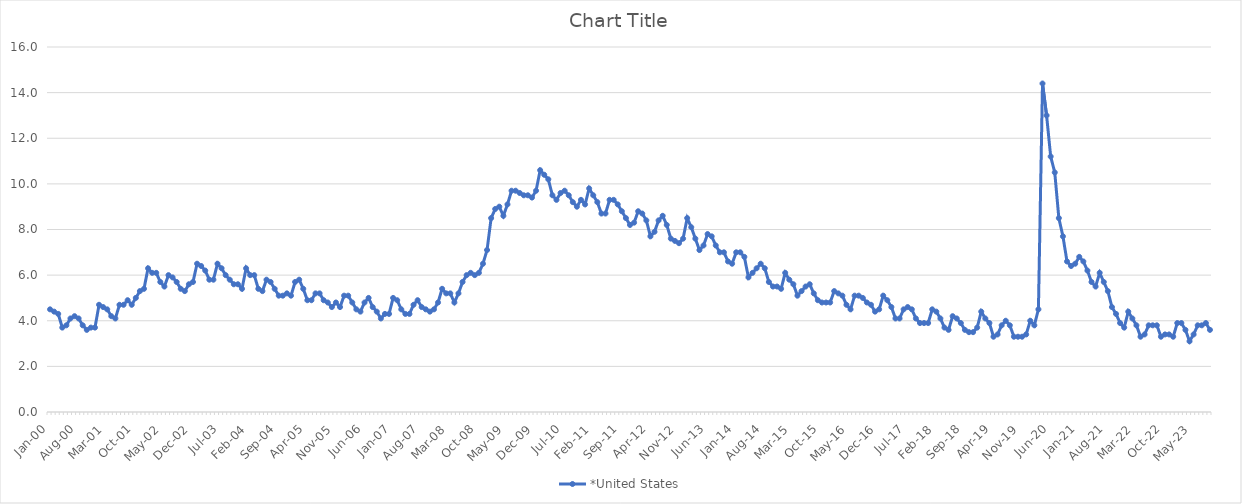
| Category | *United States | Alaska | Alabama | Arkansas | Arizona | California | Colorado | Connecticut | Delaware | Florida | Georgia | Hawaii | Iowa | Idaho | Illinois | Indiana | Kansas | Kentucky | Louisiana | Massachusetts | Maryland | Maine | Michigan | Minnesota | Missouri | Mississippi | Montana | North Carolina | North Dakota | Nebraska | New Hampshire | New Jersey | New Mexico | Nevada | New York | Ohio | Oklahoma | Oregon | Pennsylvania | Rhode Island | South Carolina | South Dakota | Tennessee | Texas | Utah | Virginia | Vermont | Washington | Wisconsin | West Virginia | Wyoming |
|---|---|---|---|---|---|---|---|---|---|---|---|---|---|---|---|---|---|---|---|---|---|---|---|---|---|---|---|---|---|---|---|---|---|---|---|---|---|---|---|---|---|---|---|---|---|---|---|---|---|---|---|
| Jan-00 | 4.5 |  |  |  |  |  |  |  |  |  |  |  |  |  |  |  |  |  |  |  |  |  |  |  |  |  |  |  |  |  |  |  |  |  |  |  |  |  |  |  |  |  |  |  |  |  |  |  |  |  |  |
| Feb-00 | 4.4 |  |  |  |  |  |  |  |  |  |  |  |  |  |  |  |  |  |  |  |  |  |  |  |  |  |  |  |  |  |  |  |  |  |  |  |  |  |  |  |  |  |  |  |  |  |  |  |  |  |  |
| Mar-00 | 4.3 |  |  |  |  |  |  |  |  |  |  |  |  |  |  |  |  |  |  |  |  |  |  |  |  |  |  |  |  |  |  |  |  |  |  |  |  |  |  |  |  |  |  |  |  |  |  |  |  |  |  |
| Apr-00 | 3.7 |  |  |  |  |  |  |  |  |  |  |  |  |  |  |  |  |  |  |  |  |  |  |  |  |  |  |  |  |  |  |  |  |  |  |  |  |  |  |  |  |  |  |  |  |  |  |  |  |  |  |
| May-00 | 3.8 |  |  |  |  |  |  |  |  |  |  |  |  |  |  |  |  |  |  |  |  |  |  |  |  |  |  |  |  |  |  |  |  |  |  |  |  |  |  |  |  |  |  |  |  |  |  |  |  |  |  |
| Jun-00 | 4.1 |  |  |  |  |  |  |  |  |  |  |  |  |  |  |  |  |  |  |  |  |  |  |  |  |  |  |  |  |  |  |  |  |  |  |  |  |  |  |  |  |  |  |  |  |  |  |  |  |  |  |
| Jul-00 | 4.2 |  |  |  |  |  |  |  |  |  |  |  |  |  |  |  |  |  |  |  |  |  |  |  |  |  |  |  |  |  |  |  |  |  |  |  |  |  |  |  |  |  |  |  |  |  |  |  |  |  |  |
| Aug-00 | 4.1 |  |  |  |  |  |  |  |  |  |  |  |  |  |  |  |  |  |  |  |  |  |  |  |  |  |  |  |  |  |  |  |  |  |  |  |  |  |  |  |  |  |  |  |  |  |  |  |  |  |  |
| Sep-00 | 3.8 |  |  |  |  |  |  |  |  |  |  |  |  |  |  |  |  |  |  |  |  |  |  |  |  |  |  |  |  |  |  |  |  |  |  |  |  |  |  |  |  |  |  |  |  |  |  |  |  |  |  |
| Oct-00 | 3.6 |  |  |  |  |  |  |  |  |  |  |  |  |  |  |  |  |  |  |  |  |  |  |  |  |  |  |  |  |  |  |  |  |  |  |  |  |  |  |  |  |  |  |  |  |  |  |  |  |  |  |
| Nov-00 | 3.7 |  |  |  |  |  |  |  |  |  |  |  |  |  |  |  |  |  |  |  |  |  |  |  |  |  |  |  |  |  |  |  |  |  |  |  |  |  |  |  |  |  |  |  |  |  |  |  |  |  |  |
| Dec-00 | 3.7 |  |  |  |  |  |  |  |  |  |  |  |  |  |  |  |  |  |  |  |  |  |  |  |  |  |  |  |  |  |  |  |  |  |  |  |  |  |  |  |  |  |  |  |  |  |  |  |  |  |  |
| Jan-01 | 4.7 |  |  |  |  |  |  |  |  |  |  |  |  |  |  |  |  |  |  |  |  |  |  |  |  |  |  |  |  |  |  |  |  |  |  |  |  |  |  |  |  |  |  |  |  |  |  |  |  |  |  |
| Feb-01 | 4.6 |  |  |  |  |  |  |  |  |  |  |  |  |  |  |  |  |  |  |  |  |  |  |  |  |  |  |  |  |  |  |  |  |  |  |  |  |  |  |  |  |  |  |  |  |  |  |  |  |  |  |
| Mar-01 | 4.5 |  |  |  |  |  |  |  |  |  |  |  |  |  |  |  |  |  |  |  |  |  |  |  |  |  |  |  |  |  |  |  |  |  |  |  |  |  |  |  |  |  |  |  |  |  |  |  |  |  |  |
| Apr-01 | 4.2 |  |  |  |  |  |  |  |  |  |  |  |  |  |  |  |  |  |  |  |  |  |  |  |  |  |  |  |  |  |  |  |  |  |  |  |  |  |  |  |  |  |  |  |  |  |  |  |  |  |  |
| May-01 | 4.1 |  |  |  |  |  |  |  |  |  |  |  |  |  |  |  |  |  |  |  |  |  |  |  |  |  |  |  |  |  |  |  |  |  |  |  |  |  |  |  |  |  |  |  |  |  |  |  |  |  |  |
| Jun-01 | 4.7 |  |  |  |  |  |  |  |  |  |  |  |  |  |  |  |  |  |  |  |  |  |  |  |  |  |  |  |  |  |  |  |  |  |  |  |  |  |  |  |  |  |  |  |  |  |  |  |  |  |  |
| Jul-01 | 4.7 |  |  |  |  |  |  |  |  |  |  |  |  |  |  |  |  |  |  |  |  |  |  |  |  |  |  |  |  |  |  |  |  |  |  |  |  |  |  |  |  |  |  |  |  |  |  |  |  |  |  |
| Aug-01 | 4.9 |  |  |  |  |  |  |  |  |  |  |  |  |  |  |  |  |  |  |  |  |  |  |  |  |  |  |  |  |  |  |  |  |  |  |  |  |  |  |  |  |  |  |  |  |  |  |  |  |  |  |
| Sep-01 | 4.7 |  |  |  |  |  |  |  |  |  |  |  |  |  |  |  |  |  |  |  |  |  |  |  |  |  |  |  |  |  |  |  |  |  |  |  |  |  |  |  |  |  |  |  |  |  |  |  |  |  |  |
| Oct-01 | 5 |  |  |  |  |  |  |  |  |  |  |  |  |  |  |  |  |  |  |  |  |  |  |  |  |  |  |  |  |  |  |  |  |  |  |  |  |  |  |  |  |  |  |  |  |  |  |  |  |  |  |
| Nov-01 | 5.3 |  |  |  |  |  |  |  |  |  |  |  |  |  |  |  |  |  |  |  |  |  |  |  |  |  |  |  |  |  |  |  |  |  |  |  |  |  |  |  |  |  |  |  |  |  |  |  |  |  |  |
| Dec-01 | 5.4 |  |  |  |  |  |  |  |  |  |  |  |  |  |  |  |  |  |  |  |  |  |  |  |  |  |  |  |  |  |  |  |  |  |  |  |  |  |  |  |  |  |  |  |  |  |  |  |  |  |  |
| Jan-02 | 6.3 |  |  |  |  |  |  |  |  |  |  |  |  |  |  |  |  |  |  |  |  |  |  |  |  |  |  |  |  |  |  |  |  |  |  |  |  |  |  |  |  |  |  |  |  |  |  |  |  |  |  |
| Feb-02 | 6.1 |  |  |  |  |  |  |  |  |  |  |  |  |  |  |  |  |  |  |  |  |  |  |  |  |  |  |  |  |  |  |  |  |  |  |  |  |  |  |  |  |  |  |  |  |  |  |  |  |  |  |
| Mar-02 | 6.1 |  |  |  |  |  |  |  |  |  |  |  |  |  |  |  |  |  |  |  |  |  |  |  |  |  |  |  |  |  |  |  |  |  |  |  |  |  |  |  |  |  |  |  |  |  |  |  |  |  |  |
| Apr-02 | 5.7 |  |  |  |  |  |  |  |  |  |  |  |  |  |  |  |  |  |  |  |  |  |  |  |  |  |  |  |  |  |  |  |  |  |  |  |  |  |  |  |  |  |  |  |  |  |  |  |  |  |  |
| May-02 | 5.5 |  |  |  |  |  |  |  |  |  |  |  |  |  |  |  |  |  |  |  |  |  |  |  |  |  |  |  |  |  |  |  |  |  |  |  |  |  |  |  |  |  |  |  |  |  |  |  |  |  |  |
| Jun-02 | 6 |  |  |  |  |  |  |  |  |  |  |  |  |  |  |  |  |  |  |  |  |  |  |  |  |  |  |  |  |  |  |  |  |  |  |  |  |  |  |  |  |  |  |  |  |  |  |  |  |  |  |
| Jul-02 | 5.9 |  |  |  |  |  |  |  |  |  |  |  |  |  |  |  |  |  |  |  |  |  |  |  |  |  |  |  |  |  |  |  |  |  |  |  |  |  |  |  |  |  |  |  |  |  |  |  |  |  |  |
| Aug-02 | 5.7 |  |  |  |  |  |  |  |  |  |  |  |  |  |  |  |  |  |  |  |  |  |  |  |  |  |  |  |  |  |  |  |  |  |  |  |  |  |  |  |  |  |  |  |  |  |  |  |  |  |  |
| Sep-02 | 5.4 |  |  |  |  |  |  |  |  |  |  |  |  |  |  |  |  |  |  |  |  |  |  |  |  |  |  |  |  |  |  |  |  |  |  |  |  |  |  |  |  |  |  |  |  |  |  |  |  |  |  |
| Oct-02 | 5.3 |  |  |  |  |  |  |  |  |  |  |  |  |  |  |  |  |  |  |  |  |  |  |  |  |  |  |  |  |  |  |  |  |  |  |  |  |  |  |  |  |  |  |  |  |  |  |  |  |  |  |
| Nov-02 | 5.6 |  |  |  |  |  |  |  |  |  |  |  |  |  |  |  |  |  |  |  |  |  |  |  |  |  |  |  |  |  |  |  |  |  |  |  |  |  |  |  |  |  |  |  |  |  |  |  |  |  |  |
| Dec-02 | 5.7 |  |  |  |  |  |  |  |  |  |  |  |  |  |  |  |  |  |  |  |  |  |  |  |  |  |  |  |  |  |  |  |  |  |  |  |  |  |  |  |  |  |  |  |  |  |  |  |  |  |  |
| Jan-03 | 6.5 |  |  |  |  |  |  |  |  |  |  |  |  |  |  |  |  |  |  |  |  |  |  |  |  |  |  |  |  |  |  |  |  |  |  |  |  |  |  |  |  |  |  |  |  |  |  |  |  |  |  |
| Feb-03 | 6.4 |  |  |  |  |  |  |  |  |  |  |  |  |  |  |  |  |  |  |  |  |  |  |  |  |  |  |  |  |  |  |  |  |  |  |  |  |  |  |  |  |  |  |  |  |  |  |  |  |  |  |
| Mar-03 | 6.2 |  |  |  |  |  |  |  |  |  |  |  |  |  |  |  |  |  |  |  |  |  |  |  |  |  |  |  |  |  |  |  |  |  |  |  |  |  |  |  |  |  |  |  |  |  |  |  |  |  |  |
| Apr-03 | 5.8 |  |  |  |  |  |  |  |  |  |  |  |  |  |  |  |  |  |  |  |  |  |  |  |  |  |  |  |  |  |  |  |  |  |  |  |  |  |  |  |  |  |  |  |  |  |  |  |  |  |  |
| May-03 | 5.8 |  |  |  |  |  |  |  |  |  |  |  |  |  |  |  |  |  |  |  |  |  |  |  |  |  |  |  |  |  |  |  |  |  |  |  |  |  |  |  |  |  |  |  |  |  |  |  |  |  |  |
| Jun-03 | 6.5 |  |  |  |  |  |  |  |  |  |  |  |  |  |  |  |  |  |  |  |  |  |  |  |  |  |  |  |  |  |  |  |  |  |  |  |  |  |  |  |  |  |  |  |  |  |  |  |  |  |  |
| Jul-03 | 6.3 |  |  |  |  |  |  |  |  |  |  |  |  |  |  |  |  |  |  |  |  |  |  |  |  |  |  |  |  |  |  |  |  |  |  |  |  |  |  |  |  |  |  |  |  |  |  |  |  |  |  |
| Aug-03 | 6 |  |  |  |  |  |  |  |  |  |  |  |  |  |  |  |  |  |  |  |  |  |  |  |  |  |  |  |  |  |  |  |  |  |  |  |  |  |  |  |  |  |  |  |  |  |  |  |  |  |  |
| Sep-03 | 5.8 |  |  |  |  |  |  |  |  |  |  |  |  |  |  |  |  |  |  |  |  |  |  |  |  |  |  |  |  |  |  |  |  |  |  |  |  |  |  |  |  |  |  |  |  |  |  |  |  |  |  |
| Oct-03 | 5.6 |  |  |  |  |  |  |  |  |  |  |  |  |  |  |  |  |  |  |  |  |  |  |  |  |  |  |  |  |  |  |  |  |  |  |  |  |  |  |  |  |  |  |  |  |  |  |  |  |  |  |
| Nov-03 | 5.6 |  |  |  |  |  |  |  |  |  |  |  |  |  |  |  |  |  |  |  |  |  |  |  |  |  |  |  |  |  |  |  |  |  |  |  |  |  |  |  |  |  |  |  |  |  |  |  |  |  |  |
| Dec-03 | 5.4 |  |  |  |  |  |  |  |  |  |  |  |  |  |  |  |  |  |  |  |  |  |  |  |  |  |  |  |  |  |  |  |  |  |  |  |  |  |  |  |  |  |  |  |  |  |  |  |  |  |  |
| Jan-04 | 6.3 |  |  |  |  |  |  |  |  |  |  |  |  |  |  |  |  |  |  |  |  |  |  |  |  |  |  |  |  |  |  |  |  |  |  |  |  |  |  |  |  |  |  |  |  |  |  |  |  |  |  |
| Feb-04 | 6 |  |  |  |  |  |  |  |  |  |  |  |  |  |  |  |  |  |  |  |  |  |  |  |  |  |  |  |  |  |  |  |  |  |  |  |  |  |  |  |  |  |  |  |  |  |  |  |  |  |  |
| Mar-04 | 6 |  |  |  |  |  |  |  |  |  |  |  |  |  |  |  |  |  |  |  |  |  |  |  |  |  |  |  |  |  |  |  |  |  |  |  |  |  |  |  |  |  |  |  |  |  |  |  |  |  |  |
| Apr-04 | 5.4 |  |  |  |  |  |  |  |  |  |  |  |  |  |  |  |  |  |  |  |  |  |  |  |  |  |  |  |  |  |  |  |  |  |  |  |  |  |  |  |  |  |  |  |  |  |  |  |  |  |  |
| May-04 | 5.3 |  |  |  |  |  |  |  |  |  |  |  |  |  |  |  |  |  |  |  |  |  |  |  |  |  |  |  |  |  |  |  |  |  |  |  |  |  |  |  |  |  |  |  |  |  |  |  |  |  |  |
| Jun-04 | 5.8 |  |  |  |  |  |  |  |  |  |  |  |  |  |  |  |  |  |  |  |  |  |  |  |  |  |  |  |  |  |  |  |  |  |  |  |  |  |  |  |  |  |  |  |  |  |  |  |  |  |  |
| Jul-04 | 5.7 |  |  |  |  |  |  |  |  |  |  |  |  |  |  |  |  |  |  |  |  |  |  |  |  |  |  |  |  |  |  |  |  |  |  |  |  |  |  |  |  |  |  |  |  |  |  |  |  |  |  |
| Aug-04 | 5.4 |  |  |  |  |  |  |  |  |  |  |  |  |  |  |  |  |  |  |  |  |  |  |  |  |  |  |  |  |  |  |  |  |  |  |  |  |  |  |  |  |  |  |  |  |  |  |  |  |  |  |
| Sep-04 | 5.1 |  |  |  |  |  |  |  |  |  |  |  |  |  |  |  |  |  |  |  |  |  |  |  |  |  |  |  |  |  |  |  |  |  |  |  |  |  |  |  |  |  |  |  |  |  |  |  |  |  |  |
| Oct-04 | 5.1 |  |  |  |  |  |  |  |  |  |  |  |  |  |  |  |  |  |  |  |  |  |  |  |  |  |  |  |  |  |  |  |  |  |  |  |  |  |  |  |  |  |  |  |  |  |  |  |  |  |  |
| Nov-04 | 5.2 |  |  |  |  |  |  |  |  |  |  |  |  |  |  |  |  |  |  |  |  |  |  |  |  |  |  |  |  |  |  |  |  |  |  |  |  |  |  |  |  |  |  |  |  |  |  |  |  |  |  |
| Dec-04 | 5.1 |  |  |  |  |  |  |  |  |  |  |  |  |  |  |  |  |  |  |  |  |  |  |  |  |  |  |  |  |  |  |  |  |  |  |  |  |  |  |  |  |  |  |  |  |  |  |  |  |  |  |
| Jan-05 | 5.7 |  |  |  |  |  |  |  |  |  |  |  |  |  |  |  |  |  |  |  |  |  |  |  |  |  |  |  |  |  |  |  |  |  |  |  |  |  |  |  |  |  |  |  |  |  |  |  |  |  |  |
| Feb-05 | 5.8 |  |  |  |  |  |  |  |  |  |  |  |  |  |  |  |  |  |  |  |  |  |  |  |  |  |  |  |  |  |  |  |  |  |  |  |  |  |  |  |  |  |  |  |  |  |  |  |  |  |  |
| Mar-05 | 5.4 |  |  |  |  |  |  |  |  |  |  |  |  |  |  |  |  |  |  |  |  |  |  |  |  |  |  |  |  |  |  |  |  |  |  |  |  |  |  |  |  |  |  |  |  |  |  |  |  |  |  |
| Apr-05 | 4.9 |  |  |  |  |  |  |  |  |  |  |  |  |  |  |  |  |  |  |  |  |  |  |  |  |  |  |  |  |  |  |  |  |  |  |  |  |  |  |  |  |  |  |  |  |  |  |  |  |  |  |
| May-05 | 4.9 |  |  |  |  |  |  |  |  |  |  |  |  |  |  |  |  |  |  |  |  |  |  |  |  |  |  |  |  |  |  |  |  |  |  |  |  |  |  |  |  |  |  |  |  |  |  |  |  |  |  |
| Jun-05 | 5.2 |  |  |  |  |  |  |  |  |  |  |  |  |  |  |  |  |  |  |  |  |  |  |  |  |  |  |  |  |  |  |  |  |  |  |  |  |  |  |  |  |  |  |  |  |  |  |  |  |  |  |
| Jul-05 | 5.2 |  |  |  |  |  |  |  |  |  |  |  |  |  |  |  |  |  |  |  |  |  |  |  |  |  |  |  |  |  |  |  |  |  |  |  |  |  |  |  |  |  |  |  |  |  |  |  |  |  |  |
| Aug-05 | 4.9 |  |  |  |  |  |  |  |  |  |  |  |  |  |  |  |  |  |  |  |  |  |  |  |  |  |  |  |  |  |  |  |  |  |  |  |  |  |  |  |  |  |  |  |  |  |  |  |  |  |  |
| Sep-05 | 4.8 |  |  |  |  |  |  |  |  |  |  |  |  |  |  |  |  |  |  |  |  |  |  |  |  |  |  |  |  |  |  |  |  |  |  |  |  |  |  |  |  |  |  |  |  |  |  |  |  |  |  |
| Oct-05 | 4.6 |  |  |  |  |  |  |  |  |  |  |  |  |  |  |  |  |  |  |  |  |  |  |  |  |  |  |  |  |  |  |  |  |  |  |  |  |  |  |  |  |  |  |  |  |  |  |  |  |  |  |
| Nov-05 | 4.8 |  |  |  |  |  |  |  |  |  |  |  |  |  |  |  |  |  |  |  |  |  |  |  |  |  |  |  |  |  |  |  |  |  |  |  |  |  |  |  |  |  |  |  |  |  |  |  |  |  |  |
| Dec-05 | 4.6 |  |  |  |  |  |  |  |  |  |  |  |  |  |  |  |  |  |  |  |  |  |  |  |  |  |  |  |  |  |  |  |  |  |  |  |  |  |  |  |  |  |  |  |  |  |  |  |  |  |  |
| Jan-06 | 5.1 |  |  |  |  |  |  |  |  |  |  |  |  |  |  |  |  |  |  |  |  |  |  |  |  |  |  |  |  |  |  |  |  |  |  |  |  |  |  |  |  |  |  |  |  |  |  |  |  |  |  |
| Feb-06 | 5.1 |  |  |  |  |  |  |  |  |  |  |  |  |  |  |  |  |  |  |  |  |  |  |  |  |  |  |  |  |  |  |  |  |  |  |  |  |  |  |  |  |  |  |  |  |  |  |  |  |  |  |
| Mar-06 | 4.8 |  |  |  |  |  |  |  |  |  |  |  |  |  |  |  |  |  |  |  |  |  |  |  |  |  |  |  |  |  |  |  |  |  |  |  |  |  |  |  |  |  |  |  |  |  |  |  |  |  |  |
| Apr-06 | 4.5 |  |  |  |  |  |  |  |  |  |  |  |  |  |  |  |  |  |  |  |  |  |  |  |  |  |  |  |  |  |  |  |  |  |  |  |  |  |  |  |  |  |  |  |  |  |  |  |  |  |  |
| May-06 | 4.4 |  |  |  |  |  |  |  |  |  |  |  |  |  |  |  |  |  |  |  |  |  |  |  |  |  |  |  |  |  |  |  |  |  |  |  |  |  |  |  |  |  |  |  |  |  |  |  |  |  |  |
| Jun-06 | 4.8 |  |  |  |  |  |  |  |  |  |  |  |  |  |  |  |  |  |  |  |  |  |  |  |  |  |  |  |  |  |  |  |  |  |  |  |  |  |  |  |  |  |  |  |  |  |  |  |  |  |  |
| Jul-06 | 5 |  |  |  |  |  |  |  |  |  |  |  |  |  |  |  |  |  |  |  |  |  |  |  |  |  |  |  |  |  |  |  |  |  |  |  |  |  |  |  |  |  |  |  |  |  |  |  |  |  |  |
| Aug-06 | 4.6 |  |  |  |  |  |  |  |  |  |  |  |  |  |  |  |  |  |  |  |  |  |  |  |  |  |  |  |  |  |  |  |  |  |  |  |  |  |  |  |  |  |  |  |  |  |  |  |  |  |  |
| Sep-06 | 4.4 |  |  |  |  |  |  |  |  |  |  |  |  |  |  |  |  |  |  |  |  |  |  |  |  |  |  |  |  |  |  |  |  |  |  |  |  |  |  |  |  |  |  |  |  |  |  |  |  |  |  |
| Oct-06 | 4.1 |  |  |  |  |  |  |  |  |  |  |  |  |  |  |  |  |  |  |  |  |  |  |  |  |  |  |  |  |  |  |  |  |  |  |  |  |  |  |  |  |  |  |  |  |  |  |  |  |  |  |
| Nov-06 | 4.3 |  |  |  |  |  |  |  |  |  |  |  |  |  |  |  |  |  |  |  |  |  |  |  |  |  |  |  |  |  |  |  |  |  |  |  |  |  |  |  |  |  |  |  |  |  |  |  |  |  |  |
| Dec-06 | 4.3 |  |  |  |  |  |  |  |  |  |  |  |  |  |  |  |  |  |  |  |  |  |  |  |  |  |  |  |  |  |  |  |  |  |  |  |  |  |  |  |  |  |  |  |  |  |  |  |  |  |  |
| Jan-07 | 5 |  |  |  |  |  |  |  |  |  |  |  |  |  |  |  |  |  |  |  |  |  |  |  |  |  |  |  |  |  |  |  |  |  |  |  |  |  |  |  |  |  |  |  |  |  |  |  |  |  |  |
| Feb-07 | 4.9 |  |  |  |  |  |  |  |  |  |  |  |  |  |  |  |  |  |  |  |  |  |  |  |  |  |  |  |  |  |  |  |  |  |  |  |  |  |  |  |  |  |  |  |  |  |  |  |  |  |  |
| Mar-07 | 4.5 |  |  |  |  |  |  |  |  |  |  |  |  |  |  |  |  |  |  |  |  |  |  |  |  |  |  |  |  |  |  |  |  |  |  |  |  |  |  |  |  |  |  |  |  |  |  |  |  |  |  |
| Apr-07 | 4.3 |  |  |  |  |  |  |  |  |  |  |  |  |  |  |  |  |  |  |  |  |  |  |  |  |  |  |  |  |  |  |  |  |  |  |  |  |  |  |  |  |  |  |  |  |  |  |  |  |  |  |
| May-07 | 4.3 |  |  |  |  |  |  |  |  |  |  |  |  |  |  |  |  |  |  |  |  |  |  |  |  |  |  |  |  |  |  |  |  |  |  |  |  |  |  |  |  |  |  |  |  |  |  |  |  |  |  |
| Jun-07 | 4.7 |  |  |  |  |  |  |  |  |  |  |  |  |  |  |  |  |  |  |  |  |  |  |  |  |  |  |  |  |  |  |  |  |  |  |  |  |  |  |  |  |  |  |  |  |  |  |  |  |  |  |
| Jul-07 | 4.9 |  |  |  |  |  |  |  |  |  |  |  |  |  |  |  |  |  |  |  |  |  |  |  |  |  |  |  |  |  |  |  |  |  |  |  |  |  |  |  |  |  |  |  |  |  |  |  |  |  |  |
| Aug-07 | 4.6 |  |  |  |  |  |  |  |  |  |  |  |  |  |  |  |  |  |  |  |  |  |  |  |  |  |  |  |  |  |  |  |  |  |  |  |  |  |  |  |  |  |  |  |  |  |  |  |  |  |  |
| Sep-07 | 4.5 |  |  |  |  |  |  |  |  |  |  |  |  |  |  |  |  |  |  |  |  |  |  |  |  |  |  |  |  |  |  |  |  |  |  |  |  |  |  |  |  |  |  |  |  |  |  |  |  |  |  |
| Oct-07 | 4.4 |  |  |  |  |  |  |  |  |  |  |  |  |  |  |  |  |  |  |  |  |  |  |  |  |  |  |  |  |  |  |  |  |  |  |  |  |  |  |  |  |  |  |  |  |  |  |  |  |  |  |
| Nov-07 | 4.5 |  |  |  |  |  |  |  |  |  |  |  |  |  |  |  |  |  |  |  |  |  |  |  |  |  |  |  |  |  |  |  |  |  |  |  |  |  |  |  |  |  |  |  |  |  |  |  |  |  |  |
| Dec-07 | 4.8 |  |  |  |  |  |  |  |  |  |  |  |  |  |  |  |  |  |  |  |  |  |  |  |  |  |  |  |  |  |  |  |  |  |  |  |  |  |  |  |  |  |  |  |  |  |  |  |  |  |  |
| Jan-08 | 5.4 |  |  |  |  |  |  |  |  |  |  |  |  |  |  |  |  |  |  |  |  |  |  |  |  |  |  |  |  |  |  |  |  |  |  |  |  |  |  |  |  |  |  |  |  |  |  |  |  |  |  |
| Feb-08 | 5.2 |  |  |  |  |  |  |  |  |  |  |  |  |  |  |  |  |  |  |  |  |  |  |  |  |  |  |  |  |  |  |  |  |  |  |  |  |  |  |  |  |  |  |  |  |  |  |  |  |  |  |
| Mar-08 | 5.2 |  |  |  |  |  |  |  |  |  |  |  |  |  |  |  |  |  |  |  |  |  |  |  |  |  |  |  |  |  |  |  |  |  |  |  |  |  |  |  |  |  |  |  |  |  |  |  |  |  |  |
| Apr-08 | 4.8 |  |  |  |  |  |  |  |  |  |  |  |  |  |  |  |  |  |  |  |  |  |  |  |  |  |  |  |  |  |  |  |  |  |  |  |  |  |  |  |  |  |  |  |  |  |  |  |  |  |  |
| May-08 | 5.2 |  |  |  |  |  |  |  |  |  |  |  |  |  |  |  |  |  |  |  |  |  |  |  |  |  |  |  |  |  |  |  |  |  |  |  |  |  |  |  |  |  |  |  |  |  |  |  |  |  |  |
| Jun-08 | 5.7 |  |  |  |  |  |  |  |  |  |  |  |  |  |  |  |  |  |  |  |  |  |  |  |  |  |  |  |  |  |  |  |  |  |  |  |  |  |  |  |  |  |  |  |  |  |  |  |  |  |  |
| Jul-08 | 6 |  |  |  |  |  |  |  |  |  |  |  |  |  |  |  |  |  |  |  |  |  |  |  |  |  |  |  |  |  |  |  |  |  |  |  |  |  |  |  |  |  |  |  |  |  |  |  |  |  |  |
| Aug-08 | 6.1 |  |  |  |  |  |  |  |  |  |  |  |  |  |  |  |  |  |  |  |  |  |  |  |  |  |  |  |  |  |  |  |  |  |  |  |  |  |  |  |  |  |  |  |  |  |  |  |  |  |  |
| Sep-08 | 6 |  |  |  |  |  |  |  |  |  |  |  |  |  |  |  |  |  |  |  |  |  |  |  |  |  |  |  |  |  |  |  |  |  |  |  |  |  |  |  |  |  |  |  |  |  |  |  |  |  |  |
| Oct-08 | 6.1 |  |  |  |  |  |  |  |  |  |  |  |  |  |  |  |  |  |  |  |  |  |  |  |  |  |  |  |  |  |  |  |  |  |  |  |  |  |  |  |  |  |  |  |  |  |  |  |  |  |  |
| Nov-08 | 6.5 |  |  |  |  |  |  |  |  |  |  |  |  |  |  |  |  |  |  |  |  |  |  |  |  |  |  |  |  |  |  |  |  |  |  |  |  |  |  |  |  |  |  |  |  |  |  |  |  |  |  |
| Dec-08 | 7.1 |  |  |  |  |  |  |  |  |  |  |  |  |  |  |  |  |  |  |  |  |  |  |  |  |  |  |  |  |  |  |  |  |  |  |  |  |  |  |  |  |  |  |  |  |  |  |  |  |  |  |
| Jan-09 | 8.5 |  |  |  |  |  |  |  |  |  |  |  |  |  |  |  |  |  |  |  |  |  |  |  |  |  |  |  |  |  |  |  |  |  |  |  |  |  |  |  |  |  |  |  |  |  |  |  |  |  |  |
| Feb-09 | 8.9 |  |  |  |  |  |  |  |  |  |  |  |  |  |  |  |  |  |  |  |  |  |  |  |  |  |  |  |  |  |  |  |  |  |  |  |  |  |  |  |  |  |  |  |  |  |  |  |  |  |  |
| Mar-09 | 9 |  |  |  |  |  |  |  |  |  |  |  |  |  |  |  |  |  |  |  |  |  |  |  |  |  |  |  |  |  |  |  |  |  |  |  |  |  |  |  |  |  |  |  |  |  |  |  |  |  |  |
| Apr-09 | 8.6 |  |  |  |  |  |  |  |  |  |  |  |  |  |  |  |  |  |  |  |  |  |  |  |  |  |  |  |  |  |  |  |  |  |  |  |  |  |  |  |  |  |  |  |  |  |  |  |  |  |  |
| May-09 | 9.1 |  |  |  |  |  |  |  |  |  |  |  |  |  |  |  |  |  |  |  |  |  |  |  |  |  |  |  |  |  |  |  |  |  |  |  |  |  |  |  |  |  |  |  |  |  |  |  |  |  |  |
| Jun-09 | 9.7 |  |  |  |  |  |  |  |  |  |  |  |  |  |  |  |  |  |  |  |  |  |  |  |  |  |  |  |  |  |  |  |  |  |  |  |  |  |  |  |  |  |  |  |  |  |  |  |  |  |  |
| Jul-09 | 9.7 |  |  |  |  |  |  |  |  |  |  |  |  |  |  |  |  |  |  |  |  |  |  |  |  |  |  |  |  |  |  |  |  |  |  |  |  |  |  |  |  |  |  |  |  |  |  |  |  |  |  |
| Aug-09 | 9.6 |  |  |  |  |  |  |  |  |  |  |  |  |  |  |  |  |  |  |  |  |  |  |  |  |  |  |  |  |  |  |  |  |  |  |  |  |  |  |  |  |  |  |  |  |  |  |  |  |  |  |
| Sep-09 | 9.5 |  |  |  |  |  |  |  |  |  |  |  |  |  |  |  |  |  |  |  |  |  |  |  |  |  |  |  |  |  |  |  |  |  |  |  |  |  |  |  |  |  |  |  |  |  |  |  |  |  |  |
| Oct-09 | 9.5 |  |  |  |  |  |  |  |  |  |  |  |  |  |  |  |  |  |  |  |  |  |  |  |  |  |  |  |  |  |  |  |  |  |  |  |  |  |  |  |  |  |  |  |  |  |  |  |  |  |  |
| Nov-09 | 9.4 |  |  |  |  |  |  |  |  |  |  |  |  |  |  |  |  |  |  |  |  |  |  |  |  |  |  |  |  |  |  |  |  |  |  |  |  |  |  |  |  |  |  |  |  |  |  |  |  |  |  |
| Dec-09 | 9.7 |  |  |  |  |  |  |  |  |  |  |  |  |  |  |  |  |  |  |  |  |  |  |  |  |  |  |  |  |  |  |  |  |  |  |  |  |  |  |  |  |  |  |  |  |  |  |  |  |  |  |
| Jan-10 | 10.6 |  |  |  |  |  |  |  |  |  |  |  |  |  |  |  |  |  |  |  |  |  |  |  |  |  |  |  |  |  |  |  |  |  |  |  |  |  |  |  |  |  |  |  |  |  |  |  |  |  |  |
| Feb-10 | 10.4 |  |  |  |  |  |  |  |  |  |  |  |  |  |  |  |  |  |  |  |  |  |  |  |  |  |  |  |  |  |  |  |  |  |  |  |  |  |  |  |  |  |  |  |  |  |  |  |  |  |  |
| Mar-10 | 10.2 |  |  |  |  |  |  |  |  |  |  |  |  |  |  |  |  |  |  |  |  |  |  |  |  |  |  |  |  |  |  |  |  |  |  |  |  |  |  |  |  |  |  |  |  |  |  |  |  |  |  |
| Apr-10 | 9.5 |  |  |  |  |  |  |  |  |  |  |  |  |  |  |  |  |  |  |  |  |  |  |  |  |  |  |  |  |  |  |  |  |  |  |  |  |  |  |  |  |  |  |  |  |  |  |  |  |  |  |
| May-10 | 9.3 |  |  |  |  |  |  |  |  |  |  |  |  |  |  |  |  |  |  |  |  |  |  |  |  |  |  |  |  |  |  |  |  |  |  |  |  |  |  |  |  |  |  |  |  |  |  |  |  |  |  |
| Jun-10 | 9.6 |  |  |  |  |  |  |  |  |  |  |  |  |  |  |  |  |  |  |  |  |  |  |  |  |  |  |  |  |  |  |  |  |  |  |  |  |  |  |  |  |  |  |  |  |  |  |  |  |  |  |
| Jul-10 | 9.7 |  |  |  |  |  |  |  |  |  |  |  |  |  |  |  |  |  |  |  |  |  |  |  |  |  |  |  |  |  |  |  |  |  |  |  |  |  |  |  |  |  |  |  |  |  |  |  |  |  |  |
| Aug-10 | 9.5 |  |  |  |  |  |  |  |  |  |  |  |  |  |  |  |  |  |  |  |  |  |  |  |  |  |  |  |  |  |  |  |  |  |  |  |  |  |  |  |  |  |  |  |  |  |  |  |  |  |  |
| Sep-10 | 9.2 |  |  |  |  |  |  |  |  |  |  |  |  |  |  |  |  |  |  |  |  |  |  |  |  |  |  |  |  |  |  |  |  |  |  |  |  |  |  |  |  |  |  |  |  |  |  |  |  |  |  |
| Oct-10 | 9 |  |  |  |  |  |  |  |  |  |  |  |  |  |  |  |  |  |  |  |  |  |  |  |  |  |  |  |  |  |  |  |  |  |  |  |  |  |  |  |  |  |  |  |  |  |  |  |  |  |  |
| Nov-10 | 9.3 |  |  |  |  |  |  |  |  |  |  |  |  |  |  |  |  |  |  |  |  |  |  |  |  |  |  |  |  |  |  |  |  |  |  |  |  |  |  |  |  |  |  |  |  |  |  |  |  |  |  |
| Dec-10 | 9.1 |  |  |  |  |  |  |  |  |  |  |  |  |  |  |  |  |  |  |  |  |  |  |  |  |  |  |  |  |  |  |  |  |  |  |  |  |  |  |  |  |  |  |  |  |  |  |  |  |  |  |
| Jan-11 | 9.8 |  |  |  |  |  |  |  |  |  |  |  |  |  |  |  |  |  |  |  |  |  |  |  |  |  |  |  |  |  |  |  |  |  |  |  |  |  |  |  |  |  |  |  |  |  |  |  |  |  |  |
| Feb-11 | 9.5 |  |  |  |  |  |  |  |  |  |  |  |  |  |  |  |  |  |  |  |  |  |  |  |  |  |  |  |  |  |  |  |  |  |  |  |  |  |  |  |  |  |  |  |  |  |  |  |  |  |  |
| Mar-11 | 9.2 |  |  |  |  |  |  |  |  |  |  |  |  |  |  |  |  |  |  |  |  |  |  |  |  |  |  |  |  |  |  |  |  |  |  |  |  |  |  |  |  |  |  |  |  |  |  |  |  |  |  |
| Apr-11 | 8.7 |  |  |  |  |  |  |  |  |  |  |  |  |  |  |  |  |  |  |  |  |  |  |  |  |  |  |  |  |  |  |  |  |  |  |  |  |  |  |  |  |  |  |  |  |  |  |  |  |  |  |
| May-11 | 8.7 |  |  |  |  |  |  |  |  |  |  |  |  |  |  |  |  |  |  |  |  |  |  |  |  |  |  |  |  |  |  |  |  |  |  |  |  |  |  |  |  |  |  |  |  |  |  |  |  |  |  |
| Jun-11 | 9.3 |  |  |  |  |  |  |  |  |  |  |  |  |  |  |  |  |  |  |  |  |  |  |  |  |  |  |  |  |  |  |  |  |  |  |  |  |  |  |  |  |  |  |  |  |  |  |  |  |  |  |
| Jul-11 | 9.3 |  |  |  |  |  |  |  |  |  |  |  |  |  |  |  |  |  |  |  |  |  |  |  |  |  |  |  |  |  |  |  |  |  |  |  |  |  |  |  |  |  |  |  |  |  |  |  |  |  |  |
| Aug-11 | 9.1 |  |  |  |  |  |  |  |  |  |  |  |  |  |  |  |  |  |  |  |  |  |  |  |  |  |  |  |  |  |  |  |  |  |  |  |  |  |  |  |  |  |  |  |  |  |  |  |  |  |  |
| Sep-11 | 8.8 |  |  |  |  |  |  |  |  |  |  |  |  |  |  |  |  |  |  |  |  |  |  |  |  |  |  |  |  |  |  |  |  |  |  |  |  |  |  |  |  |  |  |  |  |  |  |  |  |  |  |
| Oct-11 | 8.5 |  |  |  |  |  |  |  |  |  |  |  |  |  |  |  |  |  |  |  |  |  |  |  |  |  |  |  |  |  |  |  |  |  |  |  |  |  |  |  |  |  |  |  |  |  |  |  |  |  |  |
| Nov-11 | 8.2 |  |  |  |  |  |  |  |  |  |  |  |  |  |  |  |  |  |  |  |  |  |  |  |  |  |  |  |  |  |  |  |  |  |  |  |  |  |  |  |  |  |  |  |  |  |  |  |  |  |  |
| Dec-11 | 8.3 |  |  |  |  |  |  |  |  |  |  |  |  |  |  |  |  |  |  |  |  |  |  |  |  |  |  |  |  |  |  |  |  |  |  |  |  |  |  |  |  |  |  |  |  |  |  |  |  |  |  |
| Jan-12 | 8.8 |  |  |  |  |  |  |  |  |  |  |  |  |  |  |  |  |  |  |  |  |  |  |  |  |  |  |  |  |  |  |  |  |  |  |  |  |  |  |  |  |  |  |  |  |  |  |  |  |  |  |
| Feb-12 | 8.7 |  |  |  |  |  |  |  |  |  |  |  |  |  |  |  |  |  |  |  |  |  |  |  |  |  |  |  |  |  |  |  |  |  |  |  |  |  |  |  |  |  |  |  |  |  |  |  |  |  |  |
| Mar-12 | 8.4 |  |  |  |  |  |  |  |  |  |  |  |  |  |  |  |  |  |  |  |  |  |  |  |  |  |  |  |  |  |  |  |  |  |  |  |  |  |  |  |  |  |  |  |  |  |  |  |  |  |  |
| Apr-12 | 7.7 |  |  |  |  |  |  |  |  |  |  |  |  |  |  |  |  |  |  |  |  |  |  |  |  |  |  |  |  |  |  |  |  |  |  |  |  |  |  |  |  |  |  |  |  |  |  |  |  |  |  |
| May-12 | 7.9 |  |  |  |  |  |  |  |  |  |  |  |  |  |  |  |  |  |  |  |  |  |  |  |  |  |  |  |  |  |  |  |  |  |  |  |  |  |  |  |  |  |  |  |  |  |  |  |  |  |  |
| Jun-12 | 8.4 |  |  |  |  |  |  |  |  |  |  |  |  |  |  |  |  |  |  |  |  |  |  |  |  |  |  |  |  |  |  |  |  |  |  |  |  |  |  |  |  |  |  |  |  |  |  |  |  |  |  |
| Jul-12 | 8.6 |  |  |  |  |  |  |  |  |  |  |  |  |  |  |  |  |  |  |  |  |  |  |  |  |  |  |  |  |  |  |  |  |  |  |  |  |  |  |  |  |  |  |  |  |  |  |  |  |  |  |
| Aug-12 | 8.2 |  |  |  |  |  |  |  |  |  |  |  |  |  |  |  |  |  |  |  |  |  |  |  |  |  |  |  |  |  |  |  |  |  |  |  |  |  |  |  |  |  |  |  |  |  |  |  |  |  |  |
| Sep-12 | 7.6 |  |  |  |  |  |  |  |  |  |  |  |  |  |  |  |  |  |  |  |  |  |  |  |  |  |  |  |  |  |  |  |  |  |  |  |  |  |  |  |  |  |  |  |  |  |  |  |  |  |  |
| Oct-12 | 7.5 |  |  |  |  |  |  |  |  |  |  |  |  |  |  |  |  |  |  |  |  |  |  |  |  |  |  |  |  |  |  |  |  |  |  |  |  |  |  |  |  |  |  |  |  |  |  |  |  |  |  |
| Nov-12 | 7.4 |  |  |  |  |  |  |  |  |  |  |  |  |  |  |  |  |  |  |  |  |  |  |  |  |  |  |  |  |  |  |  |  |  |  |  |  |  |  |  |  |  |  |  |  |  |  |  |  |  |  |
| Dec-12 | 7.6 |  |  |  |  |  |  |  |  |  |  |  |  |  |  |  |  |  |  |  |  |  |  |  |  |  |  |  |  |  |  |  |  |  |  |  |  |  |  |  |  |  |  |  |  |  |  |  |  |  |  |
| Jan-13 | 8.5 |  |  |  |  |  |  |  |  |  |  |  |  |  |  |  |  |  |  |  |  |  |  |  |  |  |  |  |  |  |  |  |  |  |  |  |  |  |  |  |  |  |  |  |  |  |  |  |  |  |  |
| Feb-13 | 8.1 |  |  |  |  |  |  |  |  |  |  |  |  |  |  |  |  |  |  |  |  |  |  |  |  |  |  |  |  |  |  |  |  |  |  |  |  |  |  |  |  |  |  |  |  |  |  |  |  |  |  |
| Mar-13 | 7.6 |  |  |  |  |  |  |  |  |  |  |  |  |  |  |  |  |  |  |  |  |  |  |  |  |  |  |  |  |  |  |  |  |  |  |  |  |  |  |  |  |  |  |  |  |  |  |  |  |  |  |
| Apr-13 | 7.1 |  |  |  |  |  |  |  |  |  |  |  |  |  |  |  |  |  |  |  |  |  |  |  |  |  |  |  |  |  |  |  |  |  |  |  |  |  |  |  |  |  |  |  |  |  |  |  |  |  |  |
| May-13 | 7.3 |  |  |  |  |  |  |  |  |  |  |  |  |  |  |  |  |  |  |  |  |  |  |  |  |  |  |  |  |  |  |  |  |  |  |  |  |  |  |  |  |  |  |  |  |  |  |  |  |  |  |
| Jun-13 | 7.8 |  |  |  |  |  |  |  |  |  |  |  |  |  |  |  |  |  |  |  |  |  |  |  |  |  |  |  |  |  |  |  |  |  |  |  |  |  |  |  |  |  |  |  |  |  |  |  |  |  |  |
| Jul-13 | 7.7 |  |  |  |  |  |  |  |  |  |  |  |  |  |  |  |  |  |  |  |  |  |  |  |  |  |  |  |  |  |  |  |  |  |  |  |  |  |  |  |  |  |  |  |  |  |  |  |  |  |  |
| Aug-13 | 7.3 |  |  |  |  |  |  |  |  |  |  |  |  |  |  |  |  |  |  |  |  |  |  |  |  |  |  |  |  |  |  |  |  |  |  |  |  |  |  |  |  |  |  |  |  |  |  |  |  |  |  |
| Sep-13 | 7 |  |  |  |  |  |  |  |  |  |  |  |  |  |  |  |  |  |  |  |  |  |  |  |  |  |  |  |  |  |  |  |  |  |  |  |  |  |  |  |  |  |  |  |  |  |  |  |  |  |  |
| Oct-13 | 7 |  |  |  |  |  |  |  |  |  |  |  |  |  |  |  |  |  |  |  |  |  |  |  |  |  |  |  |  |  |  |  |  |  |  |  |  |  |  |  |  |  |  |  |  |  |  |  |  |  |  |
| Nov-13 | 6.6 |  |  |  |  |  |  |  |  |  |  |  |  |  |  |  |  |  |  |  |  |  |  |  |  |  |  |  |  |  |  |  |  |  |  |  |  |  |  |  |  |  |  |  |  |  |  |  |  |  |  |
| Dec-13 | 6.5 |  |  |  |  |  |  |  |  |  |  |  |  |  |  |  |  |  |  |  |  |  |  |  |  |  |  |  |  |  |  |  |  |  |  |  |  |  |  |  |  |  |  |  |  |  |  |  |  |  |  |
| Jan-14 | 7 |  |  |  |  |  |  |  |  |  |  |  |  |  |  |  |  |  |  |  |  |  |  |  |  |  |  |  |  |  |  |  |  |  |  |  |  |  |  |  |  |  |  |  |  |  |  |  |  |  |  |
| Feb-14 | 7 |  |  |  |  |  |  |  |  |  |  |  |  |  |  |  |  |  |  |  |  |  |  |  |  |  |  |  |  |  |  |  |  |  |  |  |  |  |  |  |  |  |  |  |  |  |  |  |  |  |  |
| Mar-14 | 6.8 |  |  |  |  |  |  |  |  |  |  |  |  |  |  |  |  |  |  |  |  |  |  |  |  |  |  |  |  |  |  |  |  |  |  |  |  |  |  |  |  |  |  |  |  |  |  |  |  |  |  |
| Apr-14 | 5.9 |  |  |  |  |  |  |  |  |  |  |  |  |  |  |  |  |  |  |  |  |  |  |  |  |  |  |  |  |  |  |  |  |  |  |  |  |  |  |  |  |  |  |  |  |  |  |  |  |  |  |
| May-14 | 6.1 |  |  |  |  |  |  |  |  |  |  |  |  |  |  |  |  |  |  |  |  |  |  |  |  |  |  |  |  |  |  |  |  |  |  |  |  |  |  |  |  |  |  |  |  |  |  |  |  |  |  |
| Jun-14 | 6.3 |  |  |  |  |  |  |  |  |  |  |  |  |  |  |  |  |  |  |  |  |  |  |  |  |  |  |  |  |  |  |  |  |  |  |  |  |  |  |  |  |  |  |  |  |  |  |  |  |  |  |
| Jul-14 | 6.5 |  |  |  |  |  |  |  |  |  |  |  |  |  |  |  |  |  |  |  |  |  |  |  |  |  |  |  |  |  |  |  |  |  |  |  |  |  |  |  |  |  |  |  |  |  |  |  |  |  |  |
| Aug-14 | 6.3 |  |  |  |  |  |  |  |  |  |  |  |  |  |  |  |  |  |  |  |  |  |  |  |  |  |  |  |  |  |  |  |  |  |  |  |  |  |  |  |  |  |  |  |  |  |  |  |  |  |  |
| Sep-14 | 5.7 |  |  |  |  |  |  |  |  |  |  |  |  |  |  |  |  |  |  |  |  |  |  |  |  |  |  |  |  |  |  |  |  |  |  |  |  |  |  |  |  |  |  |  |  |  |  |  |  |  |  |
| Oct-14 | 5.5 |  |  |  |  |  |  |  |  |  |  |  |  |  |  |  |  |  |  |  |  |  |  |  |  |  |  |  |  |  |  |  |  |  |  |  |  |  |  |  |  |  |  |  |  |  |  |  |  |  |  |
| Nov-14 | 5.5 |  |  |  |  |  |  |  |  |  |  |  |  |  |  |  |  |  |  |  |  |  |  |  |  |  |  |  |  |  |  |  |  |  |  |  |  |  |  |  |  |  |  |  |  |  |  |  |  |  |  |
| Dec-14 | 5.4 |  |  |  |  |  |  |  |  |  |  |  |  |  |  |  |  |  |  |  |  |  |  |  |  |  |  |  |  |  |  |  |  |  |  |  |  |  |  |  |  |  |  |  |  |  |  |  |  |  |  |
| Jan-15 | 6.1 |  |  |  |  |  |  |  |  |  |  |  |  |  |  |  |  |  |  |  |  |  |  |  |  |  |  |  |  |  |  |  |  |  |  |  |  |  |  |  |  |  |  |  |  |  |  |  |  |  |  |
| Feb-15 | 5.8 |  |  |  |  |  |  |  |  |  |  |  |  |  |  |  |  |  |  |  |  |  |  |  |  |  |  |  |  |  |  |  |  |  |  |  |  |  |  |  |  |  |  |  |  |  |  |  |  |  |  |
| Mar-15 | 5.6 |  |  |  |  |  |  |  |  |  |  |  |  |  |  |  |  |  |  |  |  |  |  |  |  |  |  |  |  |  |  |  |  |  |  |  |  |  |  |  |  |  |  |  |  |  |  |  |  |  |  |
| Apr-15 | 5.1 |  |  |  |  |  |  |  |  |  |  |  |  |  |  |  |  |  |  |  |  |  |  |  |  |  |  |  |  |  |  |  |  |  |  |  |  |  |  |  |  |  |  |  |  |  |  |  |  |  |  |
| May-15 | 5.3 |  |  |  |  |  |  |  |  |  |  |  |  |  |  |  |  |  |  |  |  |  |  |  |  |  |  |  |  |  |  |  |  |  |  |  |  |  |  |  |  |  |  |  |  |  |  |  |  |  |  |
| Jun-15 | 5.5 |  |  |  |  |  |  |  |  |  |  |  |  |  |  |  |  |  |  |  |  |  |  |  |  |  |  |  |  |  |  |  |  |  |  |  |  |  |  |  |  |  |  |  |  |  |  |  |  |  |  |
| Jul-15 | 5.6 |  |  |  |  |  |  |  |  |  |  |  |  |  |  |  |  |  |  |  |  |  |  |  |  |  |  |  |  |  |  |  |  |  |  |  |  |  |  |  |  |  |  |  |  |  |  |  |  |  |  |
| Aug-15 | 5.2 |  |  |  |  |  |  |  |  |  |  |  |  |  |  |  |  |  |  |  |  |  |  |  |  |  |  |  |  |  |  |  |  |  |  |  |  |  |  |  |  |  |  |  |  |  |  |  |  |  |  |
| Sep-15 | 4.9 |  |  |  |  |  |  |  |  |  |  |  |  |  |  |  |  |  |  |  |  |  |  |  |  |  |  |  |  |  |  |  |  |  |  |  |  |  |  |  |  |  |  |  |  |  |  |  |  |  |  |
| Oct-15 | 4.8 |  |  |  |  |  |  |  |  |  |  |  |  |  |  |  |  |  |  |  |  |  |  |  |  |  |  |  |  |  |  |  |  |  |  |  |  |  |  |  |  |  |  |  |  |  |  |  |  |  |  |
| Nov-15 | 4.8 |  |  |  |  |  |  |  |  |  |  |  |  |  |  |  |  |  |  |  |  |  |  |  |  |  |  |  |  |  |  |  |  |  |  |  |  |  |  |  |  |  |  |  |  |  |  |  |  |  |  |
| Dec-15 | 4.8 |  |  |  |  |  |  |  |  |  |  |  |  |  |  |  |  |  |  |  |  |  |  |  |  |  |  |  |  |  |  |  |  |  |  |  |  |  |  |  |  |  |  |  |  |  |  |  |  |  |  |
| Jan-16 | 5.3 |  |  |  |  |  |  |  |  |  |  |  |  |  |  |  |  |  |  |  |  |  |  |  |  |  |  |  |  |  |  |  |  |  |  |  |  |  |  |  |  |  |  |  |  |  |  |  |  |  |  |
| Feb-16 | 5.2 |  |  |  |  |  |  |  |  |  |  |  |  |  |  |  |  |  |  |  |  |  |  |  |  |  |  |  |  |  |  |  |  |  |  |  |  |  |  |  |  |  |  |  |  |  |  |  |  |  |  |
| Mar-16 | 5.1 |  |  |  |  |  |  |  |  |  |  |  |  |  |  |  |  |  |  |  |  |  |  |  |  |  |  |  |  |  |  |  |  |  |  |  |  |  |  |  |  |  |  |  |  |  |  |  |  |  |  |
| Apr-16 | 4.7 |  |  |  |  |  |  |  |  |  |  |  |  |  |  |  |  |  |  |  |  |  |  |  |  |  |  |  |  |  |  |  |  |  |  |  |  |  |  |  |  |  |  |  |  |  |  |  |  |  |  |
| May-16 | 4.5 |  |  |  |  |  |  |  |  |  |  |  |  |  |  |  |  |  |  |  |  |  |  |  |  |  |  |  |  |  |  |  |  |  |  |  |  |  |  |  |  |  |  |  |  |  |  |  |  |  |  |
| Jun-16 | 5.1 |  |  |  |  |  |  |  |  |  |  |  |  |  |  |  |  |  |  |  |  |  |  |  |  |  |  |  |  |  |  |  |  |  |  |  |  |  |  |  |  |  |  |  |  |  |  |  |  |  |  |
| Jul-16 | 5.1 |  |  |  |  |  |  |  |  |  |  |  |  |  |  |  |  |  |  |  |  |  |  |  |  |  |  |  |  |  |  |  |  |  |  |  |  |  |  |  |  |  |  |  |  |  |  |  |  |  |  |
| Aug-16 | 5 |  |  |  |  |  |  |  |  |  |  |  |  |  |  |  |  |  |  |  |  |  |  |  |  |  |  |  |  |  |  |  |  |  |  |  |  |  |  |  |  |  |  |  |  |  |  |  |  |  |  |
| Sep-16 | 4.8 |  |  |  |  |  |  |  |  |  |  |  |  |  |  |  |  |  |  |  |  |  |  |  |  |  |  |  |  |  |  |  |  |  |  |  |  |  |  |  |  |  |  |  |  |  |  |  |  |  |  |
| Oct-16 | 4.7 |  |  |  |  |  |  |  |  |  |  |  |  |  |  |  |  |  |  |  |  |  |  |  |  |  |  |  |  |  |  |  |  |  |  |  |  |  |  |  |  |  |  |  |  |  |  |  |  |  |  |
| Nov-16 | 4.4 |  |  |  |  |  |  |  |  |  |  |  |  |  |  |  |  |  |  |  |  |  |  |  |  |  |  |  |  |  |  |  |  |  |  |  |  |  |  |  |  |  |  |  |  |  |  |  |  |  |  |
| Dec-16 | 4.5 |  |  |  |  |  |  |  |  |  |  |  |  |  |  |  |  |  |  |  |  |  |  |  |  |  |  |  |  |  |  |  |  |  |  |  |  |  |  |  |  |  |  |  |  |  |  |  |  |  |  |
| Jan-17 | 5.1 |  |  |  |  |  |  |  |  |  |  |  |  |  |  |  |  |  |  |  |  |  |  |  |  |  |  |  |  |  |  |  |  |  |  |  |  |  |  |  |  |  |  |  |  |  |  |  |  |  |  |
| Feb-17 | 4.9 |  |  |  |  |  |  |  |  |  |  |  |  |  |  |  |  |  |  |  |  |  |  |  |  |  |  |  |  |  |  |  |  |  |  |  |  |  |  |  |  |  |  |  |  |  |  |  |  |  |  |
| Mar-17 | 4.6 |  |  |  |  |  |  |  |  |  |  |  |  |  |  |  |  |  |  |  |  |  |  |  |  |  |  |  |  |  |  |  |  |  |  |  |  |  |  |  |  |  |  |  |  |  |  |  |  |  |  |
| Apr-17 | 4.1 |  |  |  |  |  |  |  |  |  |  |  |  |  |  |  |  |  |  |  |  |  |  |  |  |  |  |  |  |  |  |  |  |  |  |  |  |  |  |  |  |  |  |  |  |  |  |  |  |  |  |
| May-17 | 4.1 |  |  |  |  |  |  |  |  |  |  |  |  |  |  |  |  |  |  |  |  |  |  |  |  |  |  |  |  |  |  |  |  |  |  |  |  |  |  |  |  |  |  |  |  |  |  |  |  |  |  |
| Jun-17 | 4.5 |  |  |  |  |  |  |  |  |  |  |  |  |  |  |  |  |  |  |  |  |  |  |  |  |  |  |  |  |  |  |  |  |  |  |  |  |  |  |  |  |  |  |  |  |  |  |  |  |  |  |
| Jul-17 | 4.6 |  |  |  |  |  |  |  |  |  |  |  |  |  |  |  |  |  |  |  |  |  |  |  |  |  |  |  |  |  |  |  |  |  |  |  |  |  |  |  |  |  |  |  |  |  |  |  |  |  |  |
| Aug-17 | 4.5 |  |  |  |  |  |  |  |  |  |  |  |  |  |  |  |  |  |  |  |  |  |  |  |  |  |  |  |  |  |  |  |  |  |  |  |  |  |  |  |  |  |  |  |  |  |  |  |  |  |  |
| Sep-17 | 4.1 |  |  |  |  |  |  |  |  |  |  |  |  |  |  |  |  |  |  |  |  |  |  |  |  |  |  |  |  |  |  |  |  |  |  |  |  |  |  |  |  |  |  |  |  |  |  |  |  |  |  |
| Oct-17 | 3.9 |  |  |  |  |  |  |  |  |  |  |  |  |  |  |  |  |  |  |  |  |  |  |  |  |  |  |  |  |  |  |  |  |  |  |  |  |  |  |  |  |  |  |  |  |  |  |  |  |  |  |
| Nov-17 | 3.9 |  |  |  |  |  |  |  |  |  |  |  |  |  |  |  |  |  |  |  |  |  |  |  |  |  |  |  |  |  |  |  |  |  |  |  |  |  |  |  |  |  |  |  |  |  |  |  |  |  |  |
| Dec-17 | 3.9 |  |  |  |  |  |  |  |  |  |  |  |  |  |  |  |  |  |  |  |  |  |  |  |  |  |  |  |  |  |  |  |  |  |  |  |  |  |  |  |  |  |  |  |  |  |  |  |  |  |  |
| Jan-18 | 4.5 |  |  |  |  |  |  |  |  |  |  |  |  |  |  |  |  |  |  |  |  |  |  |  |  |  |  |  |  |  |  |  |  |  |  |  |  |  |  |  |  |  |  |  |  |  |  |  |  |  |  |
| Feb-18 | 4.4 |  |  |  |  |  |  |  |  |  |  |  |  |  |  |  |  |  |  |  |  |  |  |  |  |  |  |  |  |  |  |  |  |  |  |  |  |  |  |  |  |  |  |  |  |  |  |  |  |  |  |
| Mar-18 | 4.1 |  |  |  |  |  |  |  |  |  |  |  |  |  |  |  |  |  |  |  |  |  |  |  |  |  |  |  |  |  |  |  |  |  |  |  |  |  |  |  |  |  |  |  |  |  |  |  |  |  |  |
| Apr-18 | 3.7 |  |  |  |  |  |  |  |  |  |  |  |  |  |  |  |  |  |  |  |  |  |  |  |  |  |  |  |  |  |  |  |  |  |  |  |  |  |  |  |  |  |  |  |  |  |  |  |  |  |  |
| May-18 | 3.6 |  |  |  |  |  |  |  |  |  |  |  |  |  |  |  |  |  |  |  |  |  |  |  |  |  |  |  |  |  |  |  |  |  |  |  |  |  |  |  |  |  |  |  |  |  |  |  |  |  |  |
| Jun-18 | 4.2 |  |  |  |  |  |  |  |  |  |  |  |  |  |  |  |  |  |  |  |  |  |  |  |  |  |  |  |  |  |  |  |  |  |  |  |  |  |  |  |  |  |  |  |  |  |  |  |  |  |  |
| Jul-18 | 4.1 |  |  |  |  |  |  |  |  |  |  |  |  |  |  |  |  |  |  |  |  |  |  |  |  |  |  |  |  |  |  |  |  |  |  |  |  |  |  |  |  |  |  |  |  |  |  |  |  |  |  |
| Aug-18 | 3.9 |  |  |  |  |  |  |  |  |  |  |  |  |  |  |  |  |  |  |  |  |  |  |  |  |  |  |  |  |  |  |  |  |  |  |  |  |  |  |  |  |  |  |  |  |  |  |  |  |  |  |
| Sep-18 | 3.6 |  |  |  |  |  |  |  |  |  |  |  |  |  |  |  |  |  |  |  |  |  |  |  |  |  |  |  |  |  |  |  |  |  |  |  |  |  |  |  |  |  |  |  |  |  |  |  |  |  |  |
| Oct-18 | 3.5 |  |  |  |  |  |  |  |  |  |  |  |  |  |  |  |  |  |  |  |  |  |  |  |  |  |  |  |  |  |  |  |  |  |  |  |  |  |  |  |  |  |  |  |  |  |  |  |  |  |  |
| Nov-18 | 3.5 |  |  |  |  |  |  |  |  |  |  |  |  |  |  |  |  |  |  |  |  |  |  |  |  |  |  |  |  |  |  |  |  |  |  |  |  |  |  |  |  |  |  |  |  |  |  |  |  |  |  |
| Dec-18 | 3.7 |  |  |  |  |  |  |  |  |  |  |  |  |  |  |  |  |  |  |  |  |  |  |  |  |  |  |  |  |  |  |  |  |  |  |  |  |  |  |  |  |  |  |  |  |  |  |  |  |  |  |
| Jan-19 | 4.4 |  |  |  |  |  |  |  |  |  |  |  |  |  |  |  |  |  |  |  |  |  |  |  |  |  |  |  |  |  |  |  |  |  |  |  |  |  |  |  |  |  |  |  |  |  |  |  |  |  |  |
| Feb-19 | 4.1 |  |  |  |  |  |  |  |  |  |  |  |  |  |  |  |  |  |  |  |  |  |  |  |  |  |  |  |  |  |  |  |  |  |  |  |  |  |  |  |  |  |  |  |  |  |  |  |  |  |  |
| Mar-19 | 3.9 |  |  |  |  |  |  |  |  |  |  |  |  |  |  |  |  |  |  |  |  |  |  |  |  |  |  |  |  |  |  |  |  |  |  |  |  |  |  |  |  |  |  |  |  |  |  |  |  |  |  |
| Apr-19 | 3.3 |  |  |  |  |  |  |  |  |  |  |  |  |  |  |  |  |  |  |  |  |  |  |  |  |  |  |  |  |  |  |  |  |  |  |  |  |  |  |  |  |  |  |  |  |  |  |  |  |  |  |
| May-19 | 3.4 |  |  |  |  |  |  |  |  |  |  |  |  |  |  |  |  |  |  |  |  |  |  |  |  |  |  |  |  |  |  |  |  |  |  |  |  |  |  |  |  |  |  |  |  |  |  |  |  |  |  |
| Jun-19 | 3.8 |  |  |  |  |  |  |  |  |  |  |  |  |  |  |  |  |  |  |  |  |  |  |  |  |  |  |  |  |  |  |  |  |  |  |  |  |  |  |  |  |  |  |  |  |  |  |  |  |  |  |
| Jul-19 | 4 |  |  |  |  |  |  |  |  |  |  |  |  |  |  |  |  |  |  |  |  |  |  |  |  |  |  |  |  |  |  |  |  |  |  |  |  |  |  |  |  |  |  |  |  |  |  |  |  |  |  |
| Aug-19 | 3.8 |  |  |  |  |  |  |  |  |  |  |  |  |  |  |  |  |  |  |  |  |  |  |  |  |  |  |  |  |  |  |  |  |  |  |  |  |  |  |  |  |  |  |  |  |  |  |  |  |  |  |
| Sep-19 | 3.3 |  |  |  |  |  |  |  |  |  |  |  |  |  |  |  |  |  |  |  |  |  |  |  |  |  |  |  |  |  |  |  |  |  |  |  |  |  |  |  |  |  |  |  |  |  |  |  |  |  |  |
| Oct-19 | 3.3 |  |  |  |  |  |  |  |  |  |  |  |  |  |  |  |  |  |  |  |  |  |  |  |  |  |  |  |  |  |  |  |  |  |  |  |  |  |  |  |  |  |  |  |  |  |  |  |  |  |  |
| Nov-19 | 3.3 |  |  |  |  |  |  |  |  |  |  |  |  |  |  |  |  |  |  |  |  |  |  |  |  |  |  |  |  |  |  |  |  |  |  |  |  |  |  |  |  |  |  |  |  |  |  |  |  |  |  |
| Dec-19 | 3.4 |  |  |  |  |  |  |  |  |  |  |  |  |  |  |  |  |  |  |  |  |  |  |  |  |  |  |  |  |  |  |  |  |  |  |  |  |  |  |  |  |  |  |  |  |  |  |  |  |  |  |
| Jan-20 | 4 |  |  |  |  |  |  |  |  |  |  |  |  |  |  |  |  |  |  |  |  |  |  |  |  |  |  |  |  |  |  |  |  |  |  |  |  |  |  |  |  |  |  |  |  |  |  |  |  |  |  |
| Feb-20 | 3.8 |  |  |  |  |  |  |  |  |  |  |  |  |  |  |  |  |  |  |  |  |  |  |  |  |  |  |  |  |  |  |  |  |  |  |  |  |  |  |  |  |  |  |  |  |  |  |  |  |  |  |
| Mar-20 | 4.5 |  |  |  |  |  |  |  |  |  |  |  |  |  |  |  |  |  |  |  |  |  |  |  |  |  |  |  |  |  |  |  |  |  |  |  |  |  |  |  |  |  |  |  |  |  |  |  |  |  |  |
| Apr-20 | 14.4 |  |  |  |  |  |  |  |  |  |  |  |  |  |  |  |  |  |  |  |  |  |  |  |  |  |  |  |  |  |  |  |  |  |  |  |  |  |  |  |  |  |  |  |  |  |  |  |  |  |  |
| May-20 | 13 |  |  |  |  |  |  |  |  |  |  |  |  |  |  |  |  |  |  |  |  |  |  |  |  |  |  |  |  |  |  |  |  |  |  |  |  |  |  |  |  |  |  |  |  |  |  |  |  |  |  |
| Jun-20 | 11.2 |  |  |  |  |  |  |  |  |  |  |  |  |  |  |  |  |  |  |  |  |  |  |  |  |  |  |  |  |  |  |  |  |  |  |  |  |  |  |  |  |  |  |  |  |  |  |  |  |  |  |
| Jul-20 | 10.5 |  |  |  |  |  |  |  |  |  |  |  |  |  |  |  |  |  |  |  |  |  |  |  |  |  |  |  |  |  |  |  |  |  |  |  |  |  |  |  |  |  |  |  |  |  |  |  |  |  |  |
| Aug-20 | 8.5 |  |  |  |  |  |  |  |  |  |  |  |  |  |  |  |  |  |  |  |  |  |  |  |  |  |  |  |  |  |  |  |  |  |  |  |  |  |  |  |  |  |  |  |  |  |  |  |  |  |  |
| Sep-20 | 7.7 |  |  |  |  |  |  |  |  |  |  |  |  |  |  |  |  |  |  |  |  |  |  |  |  |  |  |  |  |  |  |  |  |  |  |  |  |  |  |  |  |  |  |  |  |  |  |  |  |  |  |
| Oct-20 | 6.6 |  |  |  |  |  |  |  |  |  |  |  |  |  |  |  |  |  |  |  |  |  |  |  |  |  |  |  |  |  |  |  |  |  |  |  |  |  |  |  |  |  |  |  |  |  |  |  |  |  |  |
| Nov-20 | 6.4 |  |  |  |  |  |  |  |  |  |  |  |  |  |  |  |  |  |  |  |  |  |  |  |  |  |  |  |  |  |  |  |  |  |  |  |  |  |  |  |  |  |  |  |  |  |  |  |  |  |  |
| Dec-20 | 6.5 |  |  |  |  |  |  |  |  |  |  |  |  |  |  |  |  |  |  |  |  |  |  |  |  |  |  |  |  |  |  |  |  |  |  |  |  |  |  |  |  |  |  |  |  |  |  |  |  |  |  |
| Jan-21 | 6.8 |  |  |  |  |  |  |  |  |  |  |  |  |  |  |  |  |  |  |  |  |  |  |  |  |  |  |  |  |  |  |  |  |  |  |  |  |  |  |  |  |  |  |  |  |  |  |  |  |  |  |
| Feb-21 | 6.6 |  |  |  |  |  |  |  |  |  |  |  |  |  |  |  |  |  |  |  |  |  |  |  |  |  |  |  |  |  |  |  |  |  |  |  |  |  |  |  |  |  |  |  |  |  |  |  |  |  |  |
| Mar-21 | 6.2 |  |  |  |  |  |  |  |  |  |  |  |  |  |  |  |  |  |  |  |  |  |  |  |  |  |  |  |  |  |  |  |  |  |  |  |  |  |  |  |  |  |  |  |  |  |  |  |  |  |  |
| Apr-21 | 5.7 |  |  |  |  |  |  |  |  |  |  |  |  |  |  |  |  |  |  |  |  |  |  |  |  |  |  |  |  |  |  |  |  |  |  |  |  |  |  |  |  |  |  |  |  |  |  |  |  |  |  |
| May-21 | 5.5 |  |  |  |  |  |  |  |  |  |  |  |  |  |  |  |  |  |  |  |  |  |  |  |  |  |  |  |  |  |  |  |  |  |  |  |  |  |  |  |  |  |  |  |  |  |  |  |  |  |  |
| Jun-21 | 6.1 |  |  |  |  |  |  |  |  |  |  |  |  |  |  |  |  |  |  |  |  |  |  |  |  |  |  |  |  |  |  |  |  |  |  |  |  |  |  |  |  |  |  |  |  |  |  |  |  |  |  |
| Jul-21 | 5.7 |  |  |  |  |  |  |  |  |  |  |  |  |  |  |  |  |  |  |  |  |  |  |  |  |  |  |  |  |  |  |  |  |  |  |  |  |  |  |  |  |  |  |  |  |  |  |  |  |  |  |
| Aug-21 | 5.3 |  |  |  |  |  |  |  |  |  |  |  |  |  |  |  |  |  |  |  |  |  |  |  |  |  |  |  |  |  |  |  |  |  |  |  |  |  |  |  |  |  |  |  |  |  |  |  |  |  |  |
| Sep-21 | 4.6 |  |  |  |  |  |  |  |  |  |  |  |  |  |  |  |  |  |  |  |  |  |  |  |  |  |  |  |  |  |  |  |  |  |  |  |  |  |  |  |  |  |  |  |  |  |  |  |  |  |  |
| Oct-21 | 4.3 |  |  |  |  |  |  |  |  |  |  |  |  |  |  |  |  |  |  |  |  |  |  |  |  |  |  |  |  |  |  |  |  |  |  |  |  |  |  |  |  |  |  |  |  |  |  |  |  |  |  |
| Nov-21 | 3.9 |  |  |  |  |  |  |  |  |  |  |  |  |  |  |  |  |  |  |  |  |  |  |  |  |  |  |  |  |  |  |  |  |  |  |  |  |  |  |  |  |  |  |  |  |  |  |  |  |  |  |
| Dec-21 | 3.7 |  |  |  |  |  |  |  |  |  |  |  |  |  |  |  |  |  |  |  |  |  |  |  |  |  |  |  |  |  |  |  |  |  |  |  |  |  |  |  |  |  |  |  |  |  |  |  |  |  |  |
| Jan-22 | 4.4 |  |  |  |  |  |  |  |  |  |  |  |  |  |  |  |  |  |  |  |  |  |  |  |  |  |  |  |  |  |  |  |  |  |  |  |  |  |  |  |  |  |  |  |  |  |  |  |  |  |  |
| Feb-22 | 4.1 |  |  |  |  |  |  |  |  |  |  |  |  |  |  |  |  |  |  |  |  |  |  |  |  |  |  |  |  |  |  |  |  |  |  |  |  |  |  |  |  |  |  |  |  |  |  |  |  |  |  |
| Mar-22 | 3.8 |  |  |  |  |  |  |  |  |  |  |  |  |  |  |  |  |  |  |  |  |  |  |  |  |  |  |  |  |  |  |  |  |  |  |  |  |  |  |  |  |  |  |  |  |  |  |  |  |  |  |
| Apr-22 | 3.3 |  |  |  |  |  |  |  |  |  |  |  |  |  |  |  |  |  |  |  |  |  |  |  |  |  |  |  |  |  |  |  |  |  |  |  |  |  |  |  |  |  |  |  |  |  |  |  |  |  |  |
| May-22 | 3.4 |  |  |  |  |  |  |  |  |  |  |  |  |  |  |  |  |  |  |  |  |  |  |  |  |  |  |  |  |  |  |  |  |  |  |  |  |  |  |  |  |  |  |  |  |  |  |  |  |  |  |
| Jun-22 | 3.8 |  |  |  |  |  |  |  |  |  |  |  |  |  |  |  |  |  |  |  |  |  |  |  |  |  |  |  |  |  |  |  |  |  |  |  |  |  |  |  |  |  |  |  |  |  |  |  |  |  |  |
| Jul-22 | 3.8 |  |  |  |  |  |  |  |  |  |  |  |  |  |  |  |  |  |  |  |  |  |  |  |  |  |  |  |  |  |  |  |  |  |  |  |  |  |  |  |  |  |  |  |  |  |  |  |  |  |  |
| Aug-22 | 3.8 |  |  |  |  |  |  |  |  |  |  |  |  |  |  |  |  |  |  |  |  |  |  |  |  |  |  |  |  |  |  |  |  |  |  |  |  |  |  |  |  |  |  |  |  |  |  |  |  |  |  |
| Sep-22 | 3.3 |  |  |  |  |  |  |  |  |  |  |  |  |  |  |  |  |  |  |  |  |  |  |  |  |  |  |  |  |  |  |  |  |  |  |  |  |  |  |  |  |  |  |  |  |  |  |  |  |  |  |
| Oct-22 | 3.4 |  |  |  |  |  |  |  |  |  |  |  |  |  |  |  |  |  |  |  |  |  |  |  |  |  |  |  |  |  |  |  |  |  |  |  |  |  |  |  |  |  |  |  |  |  |  |  |  |  |  |
| Nov-22 | 3.4 |  |  |  |  |  |  |  |  |  |  |  |  |  |  |  |  |  |  |  |  |  |  |  |  |  |  |  |  |  |  |  |  |  |  |  |  |  |  |  |  |  |  |  |  |  |  |  |  |  |  |
| Dec-22 | 3.3 |  |  |  |  |  |  |  |  |  |  |  |  |  |  |  |  |  |  |  |  |  |  |  |  |  |  |  |  |  |  |  |  |  |  |  |  |  |  |  |  |  |  |  |  |  |  |  |  |  |  |
| Jan-23 | 3.9 |  |  |  |  |  |  |  |  |  |  |  |  |  |  |  |  |  |  |  |  |  |  |  |  |  |  |  |  |  |  |  |  |  |  |  |  |  |  |  |  |  |  |  |  |  |  |  |  |  |  |
| Feb-23 | 3.9 |  |  |  |  |  |  |  |  |  |  |  |  |  |  |  |  |  |  |  |  |  |  |  |  |  |  |  |  |  |  |  |  |  |  |  |  |  |  |  |  |  |  |  |  |  |  |  |  |  |  |
| Mar-23 | 3.6 |  |  |  |  |  |  |  |  |  |  |  |  |  |  |  |  |  |  |  |  |  |  |  |  |  |  |  |  |  |  |  |  |  |  |  |  |  |  |  |  |  |  |  |  |  |  |  |  |  |  |
| Apr-23 | 3.1 |  |  |  |  |  |  |  |  |  |  |  |  |  |  |  |  |  |  |  |  |  |  |  |  |  |  |  |  |  |  |  |  |  |  |  |  |  |  |  |  |  |  |  |  |  |  |  |  |  |  |
| May-23 | 3.4 |  |  |  |  |  |  |  |  |  |  |  |  |  |  |  |  |  |  |  |  |  |  |  |  |  |  |  |  |  |  |  |  |  |  |  |  |  |  |  |  |  |  |  |  |  |  |  |  |  |  |
| Jun-23 | 3.8 |  |  |  |  |  |  |  |  |  |  |  |  |  |  |  |  |  |  |  |  |  |  |  |  |  |  |  |  |  |  |  |  |  |  |  |  |  |  |  |  |  |  |  |  |  |  |  |  |  |  |
| Jul-23 | 3.8 |  |  |  |  |  |  |  |  |  |  |  |  |  |  |  |  |  |  |  |  |  |  |  |  |  |  |  |  |  |  |  |  |  |  |  |  |  |  |  |  |  |  |  |  |  |  |  |  |  |  |
| Aug-23 | 3.9 |  |  |  |  |  |  |  |  |  |  |  |  |  |  |  |  |  |  |  |  |  |  |  |  |  |  |  |  |  |  |  |  |  |  |  |  |  |  |  |  |  |  |  |  |  |  |  |  |  |  |
| Sep-23 | 3.6 |  |  |  |  |  |  |  |  |  |  |  |  |  |  |  |  |  |  |  |  |  |  |  |  |  |  |  |  |  |  |  |  |  |  |  |  |  |  |  |  |  |  |  |  |  |  |  |  |  |  |